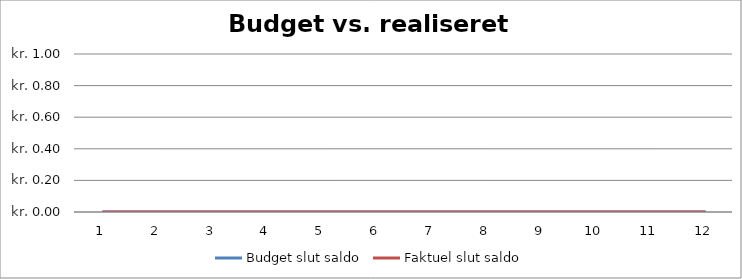
| Category | Budget slut saldo | Faktuel slut saldo |
|---|---|---|
| 0 | 0 | 0 |
| 1 | 0 | 0 |
| 2 | 0 | 0 |
| 3 | 0 | 0 |
| 4 | 0 | 0 |
| 5 | 0 | 0 |
| 6 | 0 | 0 |
| 7 | 0 | 0 |
| 8 | 0 | 0 |
| 9 | 0 | 0 |
| 10 | 0 | 0 |
| 11 | 0 | 0 |